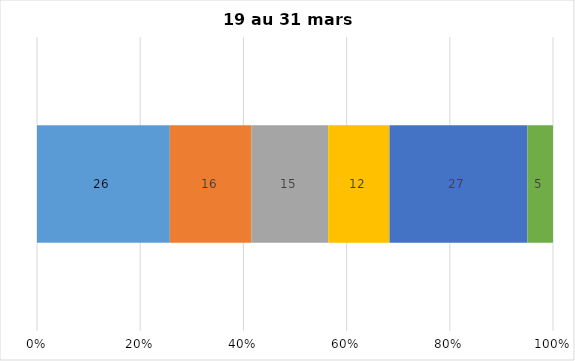
| Category | Plusieurs fois par jour | Une fois par jour | Quelques fois par semaine   | Une fois par semaine ou moins   |  Jamais   |  Je n’utilise pas les médias sociaux |
|---|---|---|---|---|---|---|
| 0 | 26 | 16 | 15 | 12 | 27 | 5 |